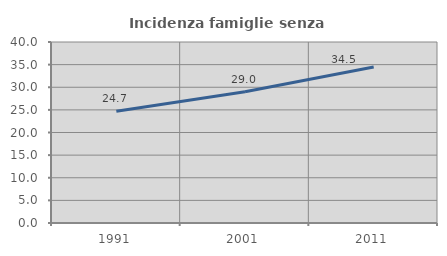
| Category | Incidenza famiglie senza nuclei |
|---|---|
| 1991.0 | 24.686 |
| 2001.0 | 29.019 |
| 2011.0 | 34.483 |